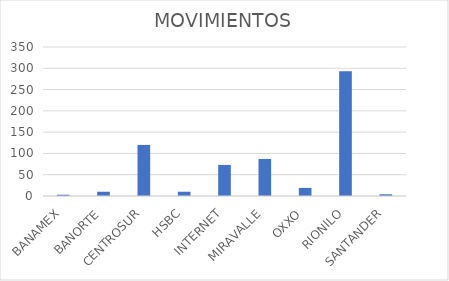
| Category | MOVIMIENTOS |
|---|---|
| BANAMEX | 3 |
| BANORTE | 10 |
| CENTROSUR | 120 |
| HSBC | 10 |
| INTERNET | 73 |
| MIRAVALLE | 87 |
| OXXO | 19 |
| RIONILO | 293 |
| SANTANDER | 4 |